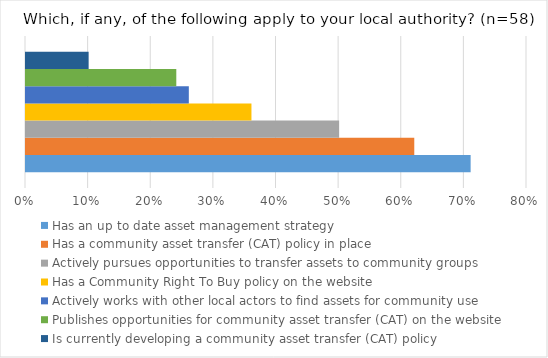
| Category | Has an up to date asset management strategy | Has a community asset transfer (CAT) policy in place | Actively pursues opportunities to transfer assets to community groups | Has a Community Right To Buy policy on the website | Actively works with other local actors to find assets for community use | Publishes opportunities for community asset transfer (CAT) on the website | Is currently developing a community asset transfer (CAT) policy |
|---|---|---|---|---|---|---|---|
| 0 | 0.71 | 0.62 | 0.5 | 0.36 | 0.26 | 0.24 | 0.1 |